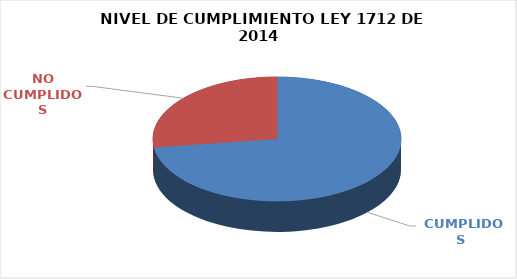
| Category | Series 0 |
|---|---|
|  CUMPLIDOS | 83 |
| NO CUMPLIDOS | 31 |